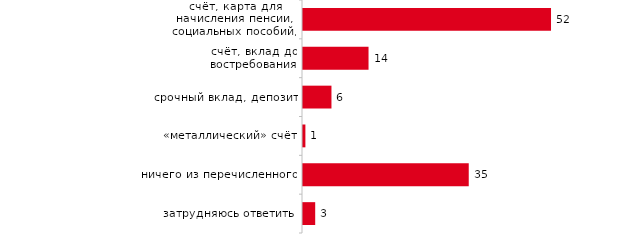
| Category | Series 0 |
|---|---|
| счёт, карта для начисления пенсии, социальных пособий, стипендии | 51.85 |
| счёт, вклад до востребования | 13.7 |
| срочный вклад, депозит | 5.95 |
| «металлический» счёт | 0.5 |
| ничего из перечисленного | 34.65 |
| затрудняюсь ответить | 2.55 |